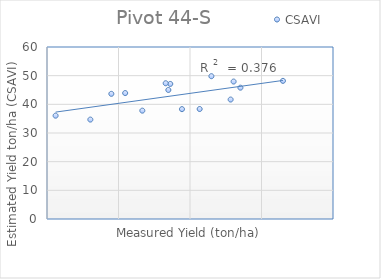
| Category | CSAVI |
|---|---|
| 42.240001 | 47.111 |
| 41.599998 | 47.349 |
| 34.0 | 43.654 |
| 41.972999 | 45.005 |
| 26.202999 | 36.043 |
| 31.062999 | 34.678 |
| 52.049999 | 45.809 |
| 35.932998 | 43.924 |
| 51.099998 | 47.946 |
| 50.682998 | 41.667 |
| 46.349998 | 38.36 |
| 58.0 | 48.183 |
| 43.876998 | 38.322 |
| 38.333 | 37.796 |
| 47.993 | 49.814 |